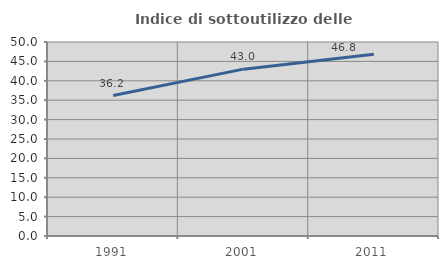
| Category | Indice di sottoutilizzo delle abitazioni  |
|---|---|
| 1991.0 | 36.188 |
| 2001.0 | 43.004 |
| 2011.0 | 46.816 |